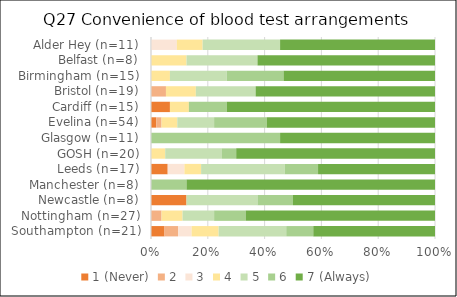
| Category | 1 (Never) | 2 | 3 | 4 | 5 | 6 | 7 (Always) |
|---|---|---|---|---|---|---|---|
| Southampton (n=21) | 1 | 1 | 1 | 2 | 5 | 2 | 9 |
| Nottingham (n=27) | 0 | 1 | 0 | 2 | 3 | 3 | 18 |
| Newcastle (n=8) | 1 | 0 | 0 | 0 | 2 | 1 | 4 |
| Manchester (n=8) | 0 | 0 | 0 | 0 | 0 | 1 | 7 |
| Leeds (n=17) | 1 | 0 | 1 | 1 | 5 | 2 | 7 |
| GOSH (n=20) | 0 | 0 | 0 | 1 | 4 | 1 | 14 |
| Glasgow (n=11) | 0 | 0 | 0 | 0 | 0 | 5 | 6 |
| Evelina (n=54) | 1 | 1 | 0 | 3 | 7 | 10 | 32 |
| Cardiff (n=15) | 1 | 0 | 0 | 1 | 0 | 2 | 11 |
| Bristol (n=19) | 0 | 1 | 0 | 2 | 4 | 0 | 12 |
| Birmingham (n=15) | 0 | 0 | 0 | 1 | 3 | 3 | 8 |
| Belfast (n=8) | 0 | 0 | 0 | 1 | 2 | 0 | 5 |
| Alder Hey (n=11) | 0 | 0 | 1 | 1 | 3 | 0 | 6 |